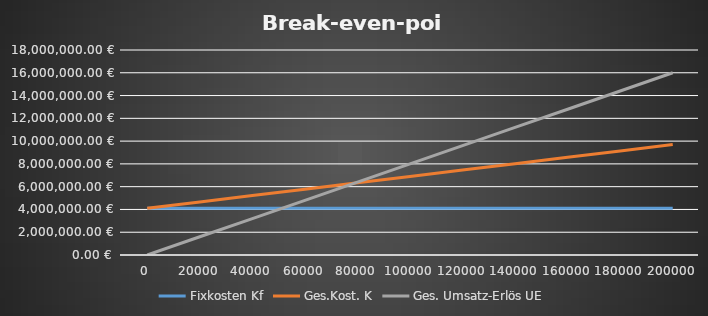
| Category | Fixkosten Kf | Ges.Kost. K | Ges. Umsatz-Erlös UE |
|---|---|---|---|
| 0.0 | 4100000 | 4100000 | 0 |
| 20000.0 | 4100000 | 4660000 | 1600000 |
| 40000.0 | 4100000 | 5220000 | 3200000 |
| 60000.0 | 4100000 | 5780000 | 4800000 |
| 80000.0 | 4100000 | 6340000 | 6400000 |
| 100000.0 | 4100000 | 6900000 | 8000000 |
| 120000.0 | 4100000 | 7460000 | 9600000 |
| 140000.0 | 4100000 | 8020000 | 11200000 |
| 160000.0 | 4100000 | 8580000 | 12800000 |
| 180000.0 | 4100000 | 9140000 | 14400000 |
| 200000.0 | 4100000 | 9700000 | 16000000 |